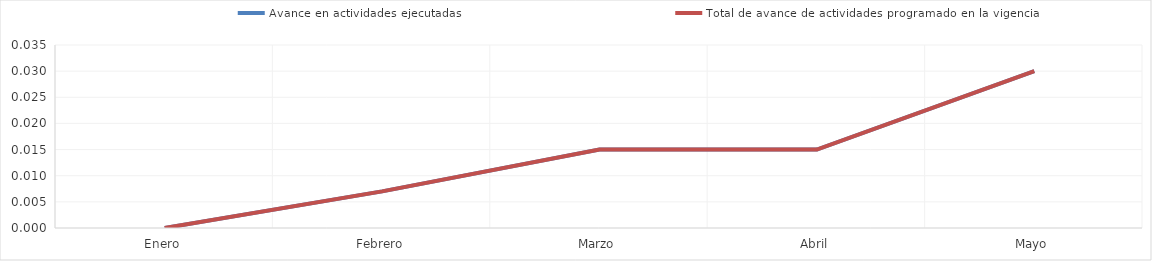
| Category | Avance en actividades ejecutadas | Total de avance de actividades programado en la vigencia |
|---|---|---|
| 0 | 0 | 0 |
| 1 | 0.007 | 0.007 |
| 2 | 0.015 | 0.015 |
| 3 | 0.015 | 0.015 |
| 4 | 0.03 | 0.03 |